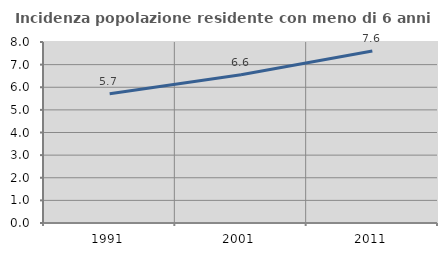
| Category | Incidenza popolazione residente con meno di 6 anni |
|---|---|
| 1991.0 | 5.713 |
| 2001.0 | 6.555 |
| 2011.0 | 7.6 |